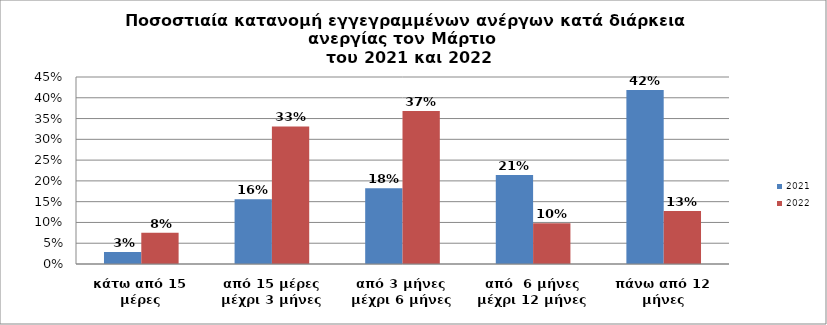
| Category | 2021 | 2022 |
|---|---|---|
| κάτω από 15 μέρες | 0.029 | 0.075 |
| από 15 μέρες μέχρι 3 μήνες | 0.156 | 0.331 |
| από 3 μήνες μέχρι 6 μήνες | 0.182 | 0.368 |
| από  6 μήνες μέχρι 12 μήνες | 0.214 | 0.098 |
| πάνω από 12 μήνες | 0.419 | 0.128 |